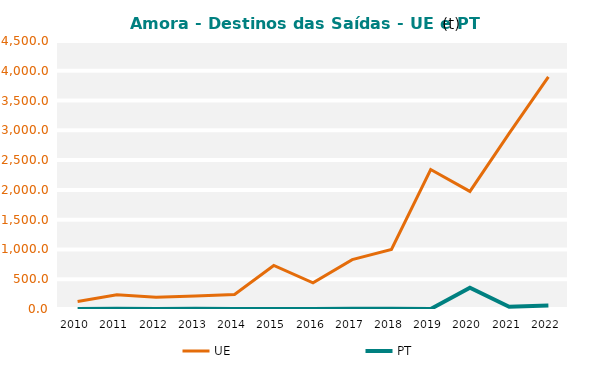
| Category | UE | PT |
|---|---|---|
| 2010.0 | 126.321 | 0.174 |
| 2011.0 | 238.881 | 2.605 |
| 2012.0 | 197.796 | 0.589 |
| 2013.0 | 218.119 | 3.105 |
| 2014.0 | 242.501 | 1.011 |
| 2015.0 | 730.796 | 0.274 |
| 2016.0 | 440.078 | 1.74 |
| 2017.0 | 828.549 | 3.047 |
| 2018.0 | 998.522 | 2.113 |
| 2019.0 | 2342.732 | 0.798 |
| 2020.0 | 1974.433 | 355.551 |
| 2021.0 | 2949.373 | 36.229 |
| 2022.0 | 3899.077 | 56.886 |